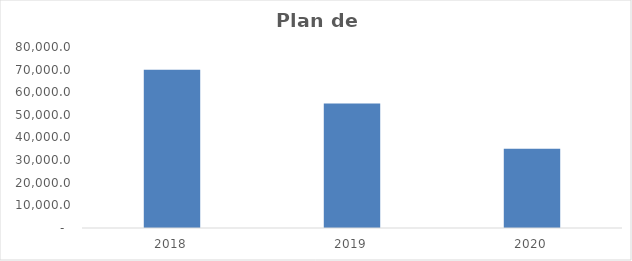
| Category | Plan de inversión |
|---|---|
| 2018.0 | 70000 |
| 2019.0 | 55000 |
| 2020.0 | 35000 |